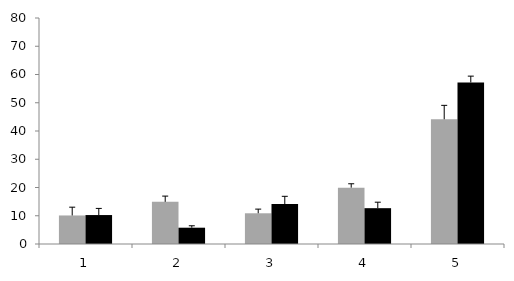
| Category | Average wt Ctip2 C2/Rluc | Average 315T Ctip2 C2/Rluc |
|---|---|---|
| 0 | 10.101 | 10.248 |
| 1 | 14.927 | 5.768 |
| 2 | 10.874 | 14.121 |
| 3 | 19.947 | 12.682 |
| 4 | 44.151 | 57.181 |